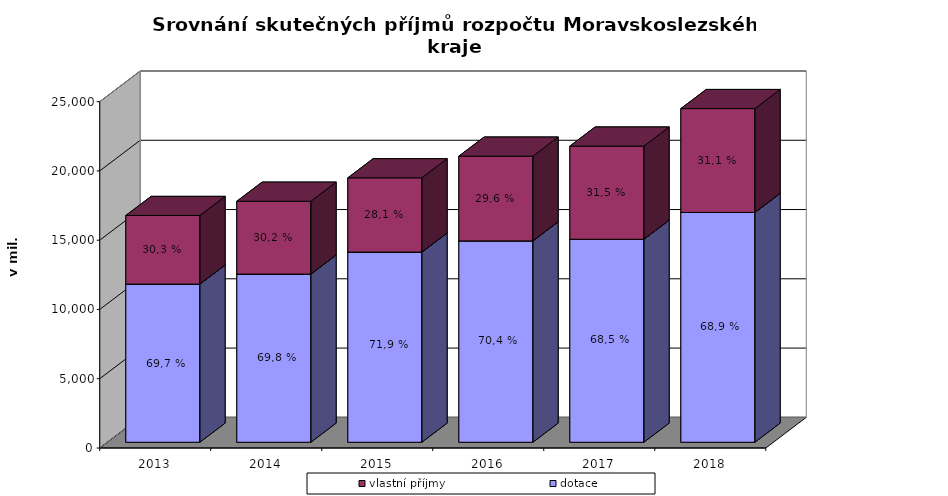
| Category | dotace | vlastní příjmy |
|---|---|---|
| 2013.0 | 11415.746 | 4951.1 |
| 2014.0 | 12137.583 | 5259.023 |
| 2015.0 | 13726.48 | 5360.395 |
| 2016.0 | 14534.133 | 6116.069 |
| 2017.0 | 14651.604 | 6723.521 |
| 2018.0 | 16584.967 | 7499.883 |